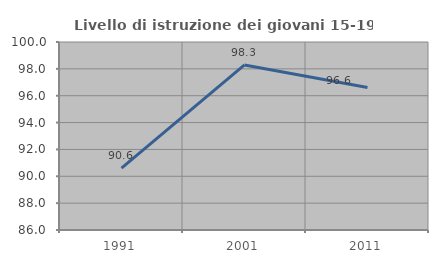
| Category | Livello di istruzione dei giovani 15-19 anni |
|---|---|
| 1991.0 | 90.604 |
| 2001.0 | 98.291 |
| 2011.0 | 96.61 |